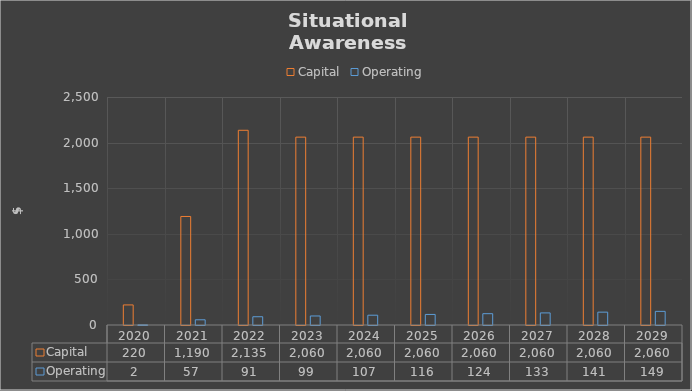
| Category | Capital | Operating |
|---|---|---|
| 2020.0 | 220 | 2 |
| 2021.0 | 1190 | 57.2 |
| 2022.0 | 2135 | 90.6 |
| 2023.0 | 2060 | 99 |
| 2024.0 | 2060 | 107.4 |
| 2025.0 | 2060 | 115.8 |
| 2026.0 | 2060 | 124.2 |
| 2027.0 | 2060 | 132.6 |
| 2028.0 | 2060 | 141 |
| 2029.0 | 2060 | 149.4 |